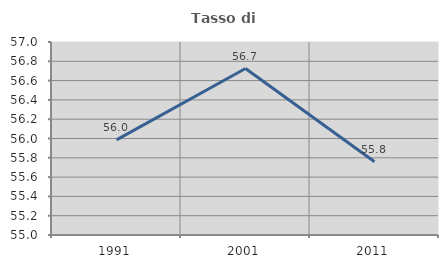
| Category | Tasso di occupazione   |
|---|---|
| 1991.0 | 55.986 |
| 2001.0 | 56.725 |
| 2011.0 | 55.76 |